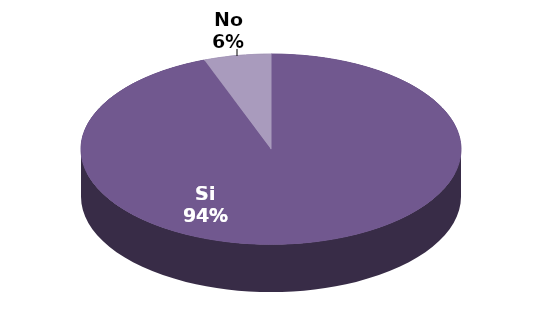
| Category | Series 1 |
|---|---|
| Si | 33 |
| No | 2 |